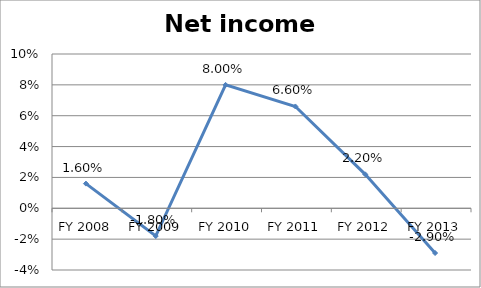
| Category | Net income ratio |
|---|---|
| FY 2013 | -0.029 |
| FY 2012 | 0.022 |
| FY 2011 | 0.066 |
| FY 2010 | 0.08 |
| FY 2009 | -0.018 |
| FY 2008 | 0.016 |